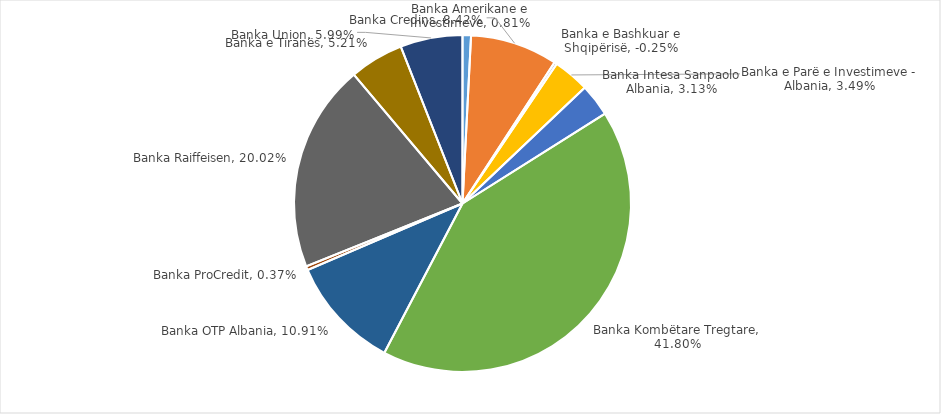
| Category | % ndaj totalit |
|---|---|
| Banka Amerikane e Investimeve | 0.008 |
| Banka Credins | 0.084 |
| Banka e Bashkuar e Shqipërisë | -0.003 |
| Banka e Parë e Investimeve - Albania | 0.035 |
| Banka Intesa Sanpaolo Albania | 0.031 |
| Banka Kombëtare Tregtare | 0.418 |
| Banka OTP Albania | 0.109 |
| Banka ProCredit | 0.004 |
| Banka Raiffeisen | 0.2 |
| Banka e Tiranës | 0.052 |
| Banka Union | 0.06 |